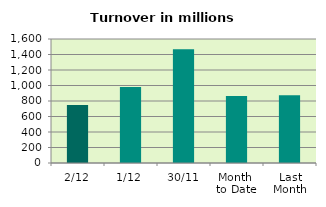
| Category | Series 0 |
|---|---|
| 2/12 | 748.761 |
| 1/12 | 979.99 |
| 30/11 | 1468.731 |
| Month 
to Date | 864.375 |
| Last
Month | 874.327 |